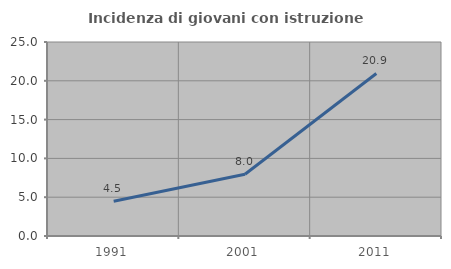
| Category | Incidenza di giovani con istruzione universitaria |
|---|---|
| 1991.0 | 4.487 |
| 2001.0 | 7.962 |
| 2011.0 | 20.949 |